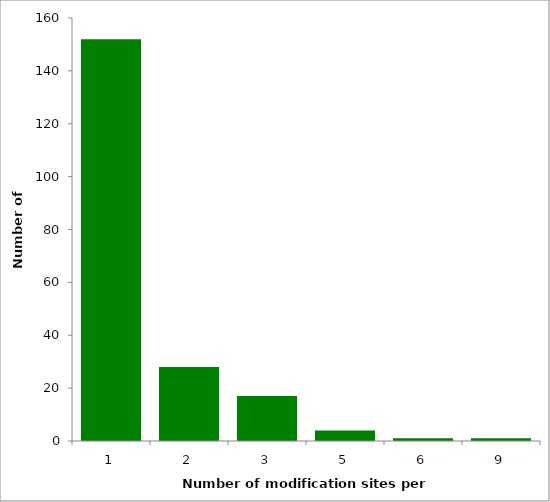
| Category | Series 0 |
|---|---|
| 1.0 | 152 |
| 2.0 | 28 |
| 3.0 | 17 |
| 5.0 | 4 |
| 6.0 | 1 |
| 9.0 | 1 |